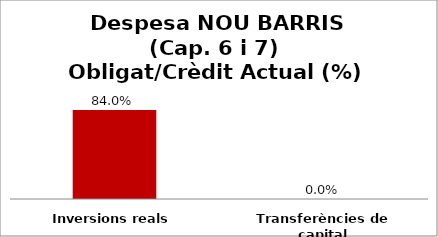
| Category | Series 0 |
|---|---|
| Inversions reals | 0.84 |
| Transferències de capital | 0 |